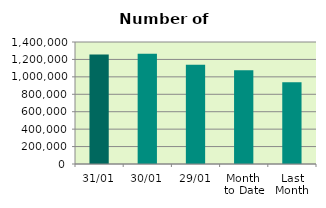
| Category | Series 0 |
|---|---|
| 31/01 | 1255646 |
| 30/01 | 1265958 |
| 29/01 | 1140236 |
| Month 
to Date | 1075899.909 |
| Last
Month | 938735.9 |